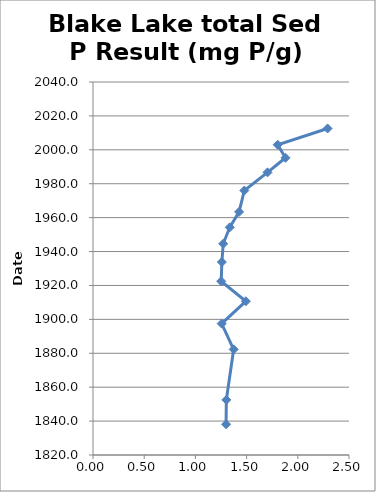
| Category | total Sed P Result (mg P/g) |
|---|---|
| 2.290942458353105 | 2012.6 |
| 1.803680365951221 | 2003 |
| 1.8798784907279995 | 1995.3 |
| 1.704290650476339 | 1986.7 |
| 1.4775254381655833 | 1976 |
| 1.4268722672938683 | 1963.4 |
| 1.3355993300371636 | 1954.3 |
| 1.2717850392804326 | 1944.6 |
| 1.2583903068762738 | 1933.8 |
| 1.2518275355106925 | 1922.5 |
| 1.4929060167944674 | 1910.7 |
| 1.2565529130965352 | 1897.5 |
| 1.3733915505623213 | 1882.3 |
| 1.3022191185987804 | 1852.5 |
| 1.2994369604831684 | 1838.1 |